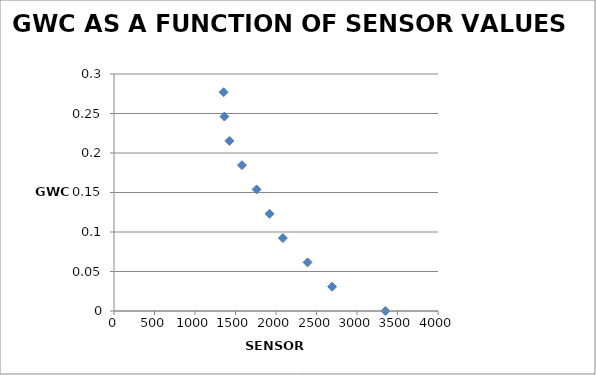
| Category | Series 0 |
|---|---|
| 3350.0 | 0 |
| 2693.0 | 0.031 |
| 2390.0 | 0.062 |
| 2085.0 | 0.092 |
| 1920.0 | 0.123 |
| 1760.0 | 0.154 |
| 1580.0 | 0.185 |
| 1425.0 | 0.215 |
| 1363.0 | 0.246 |
| 1353.0 | 0.277 |